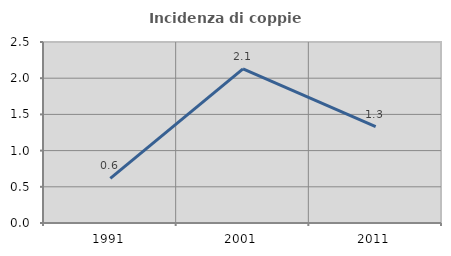
| Category | Incidenza di coppie miste |
|---|---|
| 1991.0 | 0.617 |
| 2001.0 | 2.128 |
| 2011.0 | 1.332 |